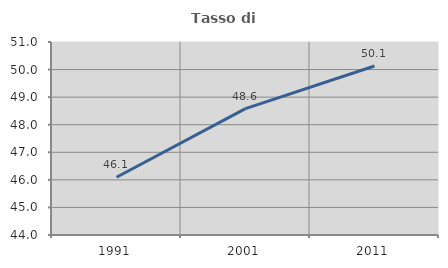
| Category | Tasso di occupazione   |
|---|---|
| 1991.0 | 46.094 |
| 2001.0 | 48.586 |
| 2011.0 | 50.13 |